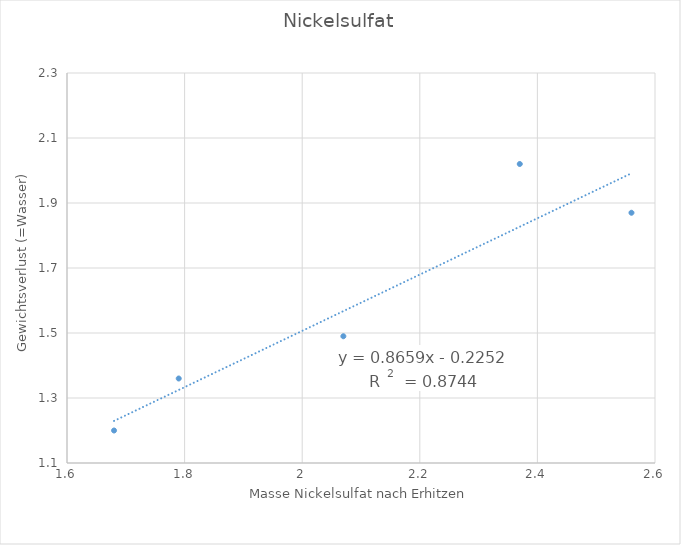
| Category | Series 0 |
|---|---|
| 2.07 | 1.49 |
| 2.56 | 1.87 |
| 1.79 | 1.36 |
| 1.68 | 1.2 |
| 2.37 | 2.02 |